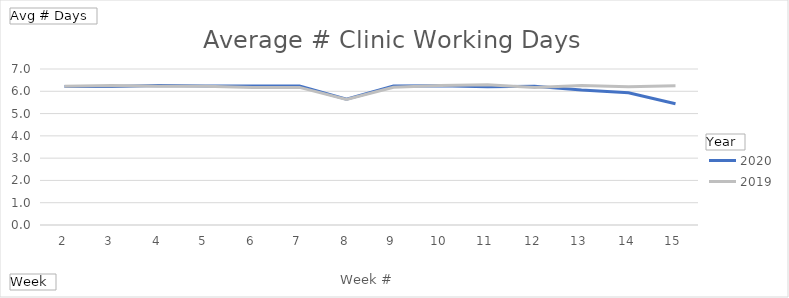
| Category | 2020 | 2019 |
|---|---|---|
| 2 | 6.219 | 6.228 |
| 3 | 6.211 | 6.263 |
| 4 | 6.263 | 6.228 |
| 5 | 6.237 | 6.228 |
| 6 | 6.237 | 6.167 |
| 7 | 6.237 | 6.175 |
| 8 | 5.64 | 5.632 |
| 9 | 6.237 | 6.184 |
| 10 | 6.246 | 6.254 |
| 11 | 6.202 | 6.298 |
| 12 | 6.221 | 6.175 |
| 13 | 6.054 | 6.254 |
| 14 | 5.936 | 6.202 |
| 15 | 5.438 | 6.246 |